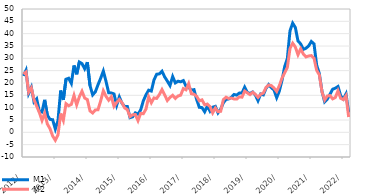
| Category | M1 | M2 |
|---|---|---|
| 2012-01-01 | 22.894 | 23.623 |
| 2012-02-01 | 25.141 | 24.458 |
| 2012-03-01 | 15.804 | 16.278 |
| 2012-04-01 | 18.252 | 18.032 |
| 2012-05-01 | 12.344 | 13.23 |
| 2012-06-01 | 13.574 | 10.607 |
| 2012-07-01 | 8.526 | 8.045 |
| 2012-08-01 | 8.225 | 4.815 |
| 2012-09-01 | 13.172 | 7.741 |
| 2012-10-01 | 6.96 | 3.373 |
| 2012-11-01 | 5.27 | 1.496 |
| 2012-12-01 | 5.109 | -1.475 |
| 2013-01-01 | 1.337 | -3.233 |
| 2013-02-01 | 4.789 | -1.06 |
| 2013-03-01 | 16.958 | 7.601 |
| 2013-04-01 | 13.162 | 4.83 |
| 2013-05-01 | 21.538 | 11.61 |
| 2013-06-01 | 21.919 | 10.771 |
| 2013-07-01 | 19.839 | 11.316 |
| 2013-08-01 | 27.102 | 14.976 |
| 2013-09-01 | 23.538 | 11.134 |
| 2013-10-01 | 28.511 | 14.404 |
| 2013-11-01 | 27.856 | 16.667 |
| 2013-12-01 | 25.775 | 13.906 |
| 2014-01-01 | 28.419 | 13.279 |
| 2014-02-01 | 18.951 | 8.684 |
| 2014-03-01 | 15.171 | 7.841 |
| 2014-04-01 | 16.413 | 9.062 |
| 2014-05-01 | 19.283 | 9.163 |
| 2014-06-01 | 21.92 | 12.745 |
| 2014-07-01 | 24.838 | 16.834 |
| 2014-08-01 | 20.711 | 14.613 |
| 2014-09-01 | 16.052 | 13.024 |
| 2014-10-01 | 15.971 | 14.42 |
| 2014-11-01 | 15.55 | 10.536 |
| 2014-12-01 | 10.973 | 12.112 |
| 2015-01-01 | 14.347 | 13.315 |
| 2015-02-01 | 11.784 | 12.027 |
| 2015-03-01 | 10.473 | 9.88 |
| 2015-04-01 | 10.477 | 9.219 |
| 2015-05-01 | 5.957 | 6.379 |
| 2015-06-01 | 6.277 | 7.137 |
| 2015-07-01 | 7.901 | 7.2 |
| 2015-08-01 | 7.374 | 4.74 |
| 2015-09-01 | 9.062 | 7.676 |
| 2015-10-01 | 12.775 | 7.543 |
| 2015-11-01 | 15.218 | 9.44 |
| 2015-12-01 | 17.083 | 14.431 |
| 2016-01-01 | 16.738 | 11.99 |
| 2016-02-01 | 21.261 | 13.949 |
| 2016-03-01 | 23.541 | 13.75 |
| 2016-04-01 | 23.712 | 15.298 |
| 2016-05-01 | 24.76 | 17.335 |
| 2016-06-01 | 22.478 | 15.149 |
| 2016-07-01 | 20.781 | 12.905 |
| 2016-08-01 | 18.976 | 14.151 |
| 2016-09-01 | 22.608 | 15.014 |
| 2016-10-01 | 20.037 | 13.76 |
| 2016-11-01 | 20.731 | 14.738 |
| 2016-12-01 | 20.493 | 15.066 |
| 2017-01-01 | 20.985 | 17.752 |
| 2017-02-01 | 18.755 | 17.238 |
| 2017-03-01 | 18.164 | 19.723 |
| 2017-04-01 | 17.137 | 15.675 |
| 2017-05-01 | 17.304 | 15.426 |
| 2017-06-01 | 13.291 | 14.629 |
| 2017-07-01 | 10.155 | 12.774 |
| 2017-08-01 | 10.008 | 13.153 |
| 2017-09-01 | 8.33 | 11.173 |
| 2017-10-01 | 10.656 | 11.444 |
| 2017-11-01 | 8.565 | 10.442 |
| 2017-12-01 | 10.17 | 7.88 |
| 2018-01-01 | 10.538 | 9.858 |
| 2018-02-01 | 7.896 | 8.367 |
| 2018-03-01 | 9.37 | 8.532 |
| 2018-04-01 | 11.942 | 13.205 |
| 2018-05-01 | 13.349 | 14.252 |
| 2018-06-01 | 13.538 | 13.74 |
| 2018-07-01 | 14.172 | 13.884 |
| 2018-08-01 | 15.344 | 13.517 |
| 2018-09-01 | 15.094 | 13.468 |
| 2018-10-31 | 15.922 | 14.378 |
| 2018-11-30 | 15.931 | 14.253 |
| 2018-12-31 | 18.316 | 16.722 |
| 2019-01-31 | 16.166 | 16.02 |
| 2019-02-28 | 15.742 | 15.287 |
| 2019-03-31 | 16.361 | 16.241 |
| 2019-04-30 | 15.105 | 15.41 |
| 2019-05-31 | 12.819 | 14.179 |
| 2019-06-30 | 15.525 | 15.44 |
| 2019-07-31 | 15.186 | 15.908 |
| 2019-08-31 | 17.797 | 18.193 |
| 2019-09-30 | 19.338 | 19.165 |
| 2019-10-31 | 18.111 | 18.951 |
| 2019-11-30 | 17.168 | 17.97 |
| 2019-12-31 | 14.043 | 16.581 |
| 2020-01-31 | 16.712 | 18.903 |
| 2020-02-29 | 21.093 | 22.007 |
| 2020-03-31 | 26.588 | 24.142 |
| 2020-04-30 | 29.94 | 26.318 |
| 2020-05-31 | 41.15 | 33.976 |
| 2020-06-30 | 44.259 | 36.145 |
| 2020-07-31 | 42.524 | 34.579 |
| 2020-08-31 | 37.03 | 31.452 |
| 2020-09-30 | 35.87 | 33.879 |
| 2020-10-31 | 33.602 | 31.759 |
| 2020-11-30 | 34.115 | 30.574 |
| 2020-12-31 | 35.024 | 30.946 |
| 2021-01-31 | 36.826 | 31.116 |
| 2021-02-28 | 35.865 | 30.063 |
| 2021-03-31 | 27.237 | 25.15 |
| 2021-04-30 | 23.823 | 23.293 |
| 2021-05-31 | 16.551 | 16.433 |
| 2021-06-30 | 12.378 | 13.116 |
| 2021-07-31 | 13.484 | 14.743 |
| 2021-08-31 | 15.449 | 14.916 |
| 2021-09-30 | 17.489 | 13.565 |
| 2021-10-31 | 17.892 | 14.138 |
| 2021-11-30 | 18.578 | 16.842 |
| 2021-12-31 | 14.836 | 13.786 |
| 2022-01-31 | 13.538 | 13.253 |
| 2022-02-28 | 15.563 | 14.867 |
| 2022-03-31 | 8.054 | 6.198 |